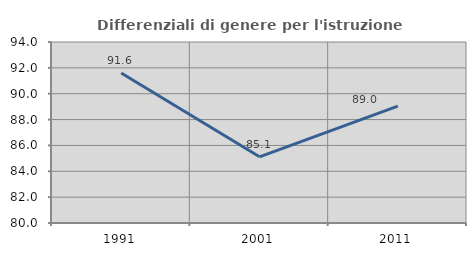
| Category | Differenziali di genere per l'istruzione superiore |
|---|---|
| 1991.0 | 91.605 |
| 2001.0 | 85.119 |
| 2011.0 | 89.041 |